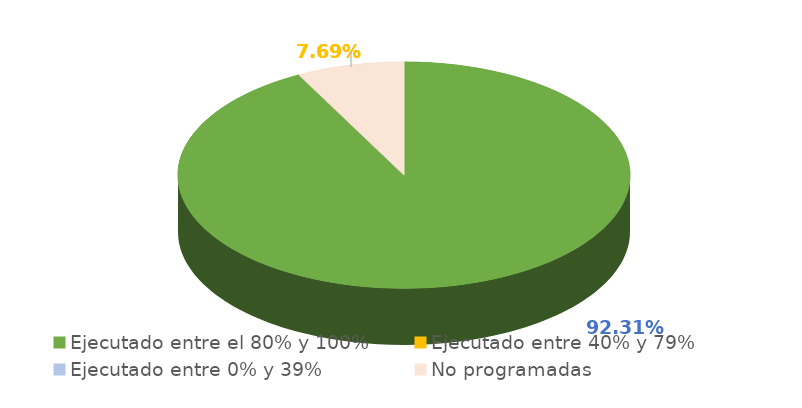
| Category | Series 0 |
|---|---|
| Ejecutado entre el 80% y 100% | 0.923 |
| Ejecutado entre 40% y 79% | 0 |
| Ejecutado entre 0% y 39% | 0 |
| No programadas | 0.077 |